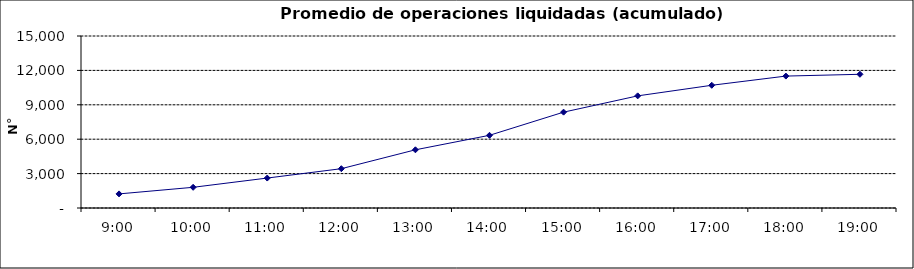
| Category | Promedio Op.Liquidadas (acumulado) |
|---|---|
| 0.375 | 1229.8 |
| 0.4166666666666667 | 1804.95 |
| 0.4583333333333333 | 2611.55 |
| 0.5 | 3428.35 |
| 0.5416666666666666 | 5075.8 |
| 0.5833333333333334 | 6339.8 |
| 0.625 | 8359.65 |
| 0.6666666666666666 | 9778.8 |
| 0.7083333333333334 | 10702.7 |
| 0.75 | 11503.55 |
| 0.7916666666666666 | 11661.45 |